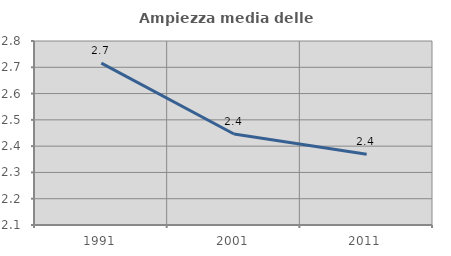
| Category | Ampiezza media delle famiglie |
|---|---|
| 1991.0 | 2.716 |
| 2001.0 | 2.446 |
| 2011.0 | 2.369 |